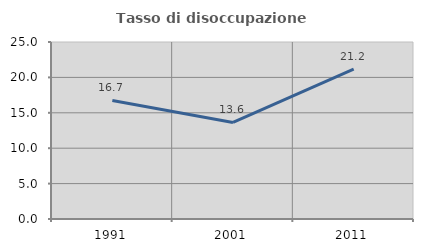
| Category | Tasso di disoccupazione giovanile  |
|---|---|
| 1991.0 | 16.744 |
| 2001.0 | 13.636 |
| 2011.0 | 21.154 |